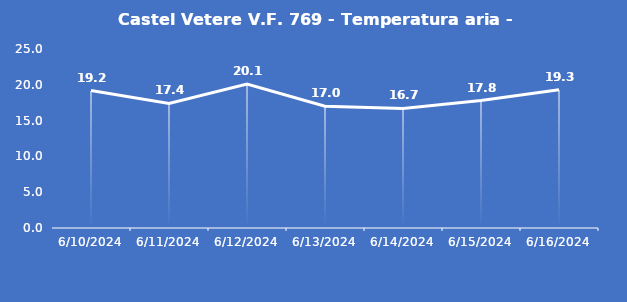
| Category | Castel Vetere V.F. 769 - Temperatura aria - Grezzo (°C) |
|---|---|
| 6/10/24 | 19.2 |
| 6/11/24 | 17.4 |
| 6/12/24 | 20.1 |
| 6/13/24 | 17 |
| 6/14/24 | 16.7 |
| 6/15/24 | 17.8 |
| 6/16/24 | 19.3 |